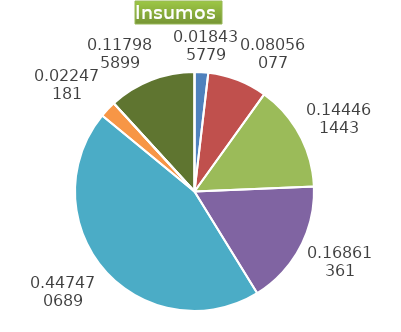
| Category | Series 0 |
|---|---|
| Control arvenses | 263763 |
| Control fitosanitario | 1152593 |
| Cosecha y beneficio | 2066827.92 |
| Fertilización | 2412376 |
| Instalación | 6402019.088 |
| Otros | 321507 |
| Podas | 0 |
| Riego | 0 |
| Transporte | 1688039 |
| Tutorado | 0 |